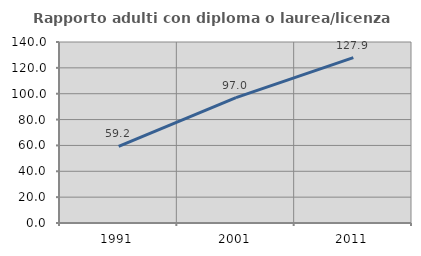
| Category | Rapporto adulti con diploma o laurea/licenza media  |
|---|---|
| 1991.0 | 59.187 |
| 2001.0 | 96.973 |
| 2011.0 | 127.894 |